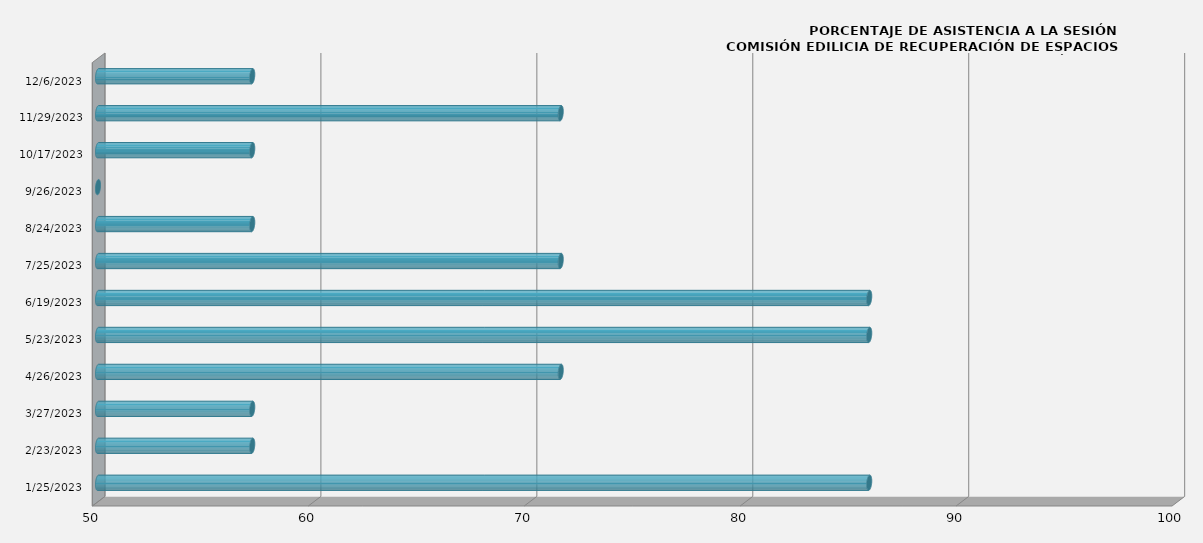
| Category | 25/01/2023 |
|---|---|
| 1/25/23 | 85.714 |
| 2/23/23 | 57.143 |
| 3/27/23 | 57.143 |
| 4/26/23 | 71.429 |
| 5/23/23 | 85.714 |
| 6/19/23 | 85.714 |
| 7/25/23 | 71.429 |
| 8/24/23 | 57.143 |
| 9/26/23 | 0 |
| 10/17/23 | 57.143 |
| 11/29/23 | 71.429 |
| 12/6/23 | 57.143 |